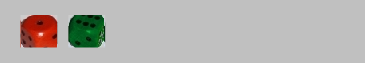
| Category | 1 | 2 | 3 | 4 | 5 | 6 |
|---|---|---|---|---|---|---|
| 1 | 1 | 0 | 0 | 0 | 0 | 0 |
| 6 | 0 | 0 | 0 | 0 | 0 | 1 |